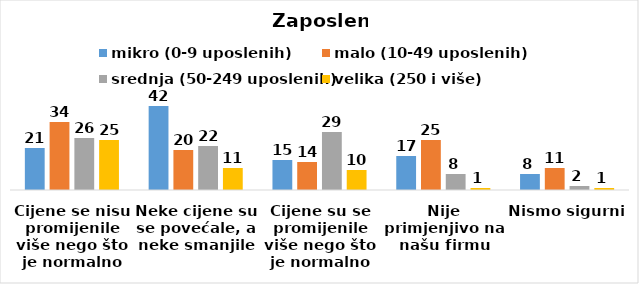
| Category | mikro (0-9 uposlenih) | malo (10-49 uposlenih) | srednja (50-249 uposlenih) | velika (250 i više) |
|---|---|---|---|---|
| Cijene se nisu promijenile više nego što je normalno | 21 | 34 | 26 | 25 |
| Neke cijene su se povećale, a neke smanjile | 42 | 20 | 22 | 11 |
| Cijene su se promijenile više nego što je normalno | 15 | 14 | 29 | 10 |
| Nije primjenjivo na našu firmu | 17 | 25 | 8 | 1 |
| Nismo sigurni | 8 | 11 | 2 | 1 |